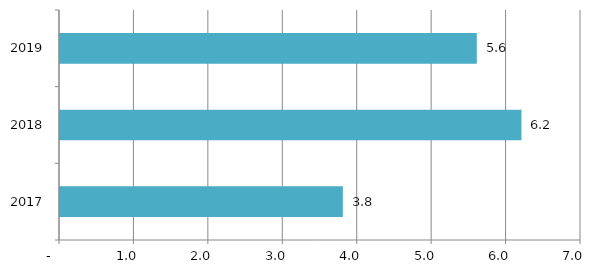
| Category | Series 0 |
|---|---|
| 2017.0 | 3.8 |
| 2018.0 | 6.2 |
| 2019.0 | 5.6 |